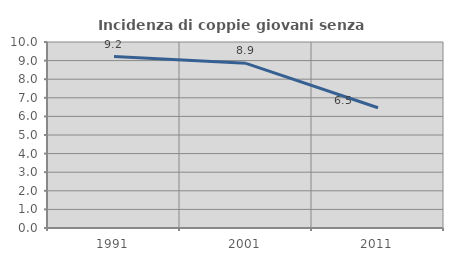
| Category | Incidenza di coppie giovani senza figli |
|---|---|
| 1991.0 | 9.22 |
| 2001.0 | 8.853 |
| 2011.0 | 6.466 |